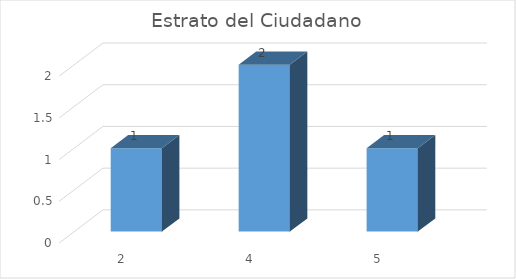
| Category | Total |
|---|---|
| 2 | 1 |
| 4 | 2 |
| 5 | 1 |